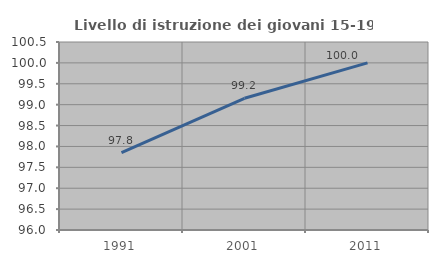
| Category | Livello di istruzione dei giovani 15-19 anni |
|---|---|
| 1991.0 | 97.849 |
| 2001.0 | 99.153 |
| 2011.0 | 100 |